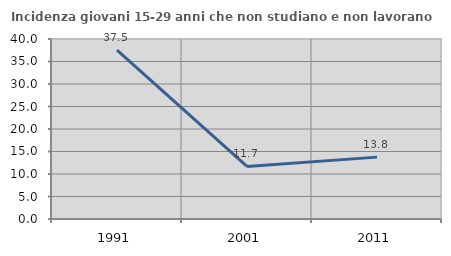
| Category | Incidenza giovani 15-29 anni che non studiano e non lavorano  |
|---|---|
| 1991.0 | 37.546 |
| 2001.0 | 11.682 |
| 2011.0 | 13.75 |